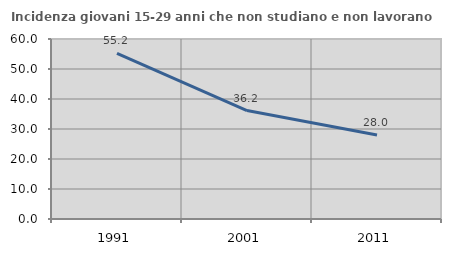
| Category | Incidenza giovani 15-29 anni che non studiano e non lavorano  |
|---|---|
| 1991.0 | 55.224 |
| 2001.0 | 36.161 |
| 2011.0 | 28 |